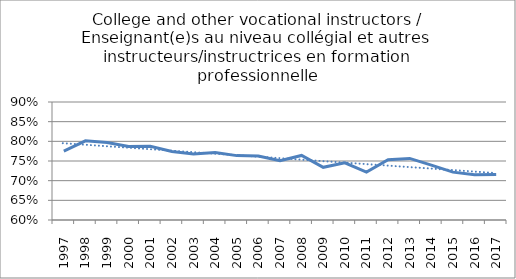
| Category | Series 0 |
|---|---|
| 1997.0 | 0.775 |
| 1998.0 | 0.801 |
| 1999.0 | 0.797 |
| 2000.0 | 0.787 |
| 2001.0 | 0.787 |
| 2002.0 | 0.774 |
| 2003.0 | 0.768 |
| 2004.0 | 0.771 |
| 2005.0 | 0.764 |
| 2006.0 | 0.763 |
| 2007.0 | 0.751 |
| 2008.0 | 0.764 |
| 2009.0 | 0.734 |
| 2010.0 | 0.745 |
| 2011.0 | 0.722 |
| 2012.0 | 0.753 |
| 2013.0 | 0.757 |
| 2014.0 | 0.74 |
| 2015.0 | 0.722 |
| 2016.0 | 0.715 |
| 2017.0 | 0.716 |